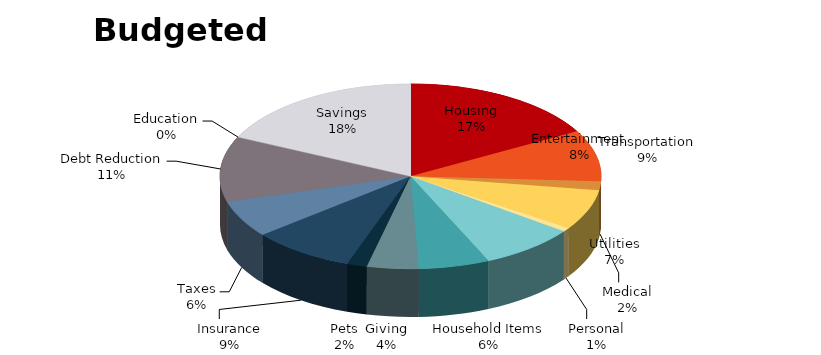
| Category | Expenses |
|---|---|
| Housing | 11800 |
| Transportation | 6270 |
| Medical | 1100 |
| Utilities | 4920 |
| Personal | 500 |
| Entertainment | 5700 |
| Household Items | 4200 |
| Giving | 3052 |
| Pets | 1200 |
| Insurance | 6100 |
| Taxes | 4500 |
| Debt Reduction | 8000 |
| Education | 0 |
| Savings | 12600 |